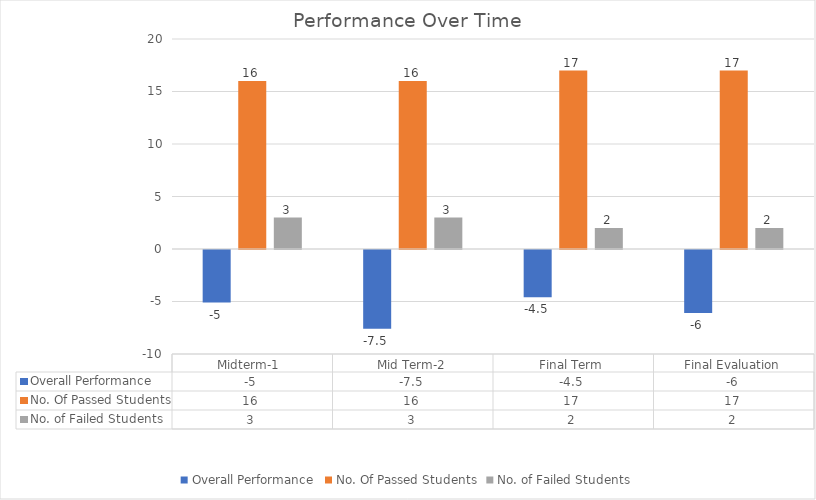
| Category | Overall Performance | No. Of Passed Students | No. of Failed Students |
|---|---|---|---|
| Midterm-1  | -5 | 16 | 3 |
| Mid Term-2 | -7.5 | 16 | 3 |
| Final Term | -4.5 | 17 | 2 |
| Final Evaluation | -6 | 17 | 2 |